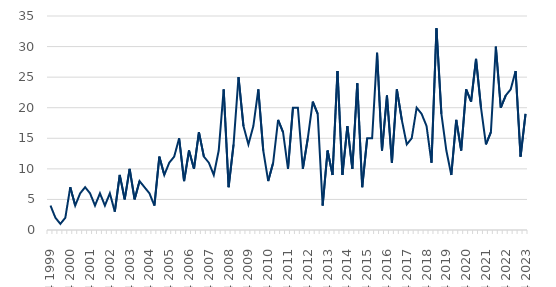
| Category | Series 0 |
|---|---|
| Q4 1999 | 4 |
| Q1 2000 | 2 |
| Q2 2000 | 1 |
| Q3 2000 | 2 |
| Q4 2000 | 7 |
| Q1 2001 | 4 |
| Q2 2001 | 6 |
| Q3 2001 | 7 |
| Q4 2001 | 6 |
| Q1 2002 | 4 |
| Q2 2002 | 6 |
| Q3 2002 | 4 |
| Q4 2002 | 6 |
| Q1 2003 | 3 |
| Q2 2003 | 9 |
| Q3 2003 | 5 |
| Q4 2003 | 10 |
| Q1 2004 | 5 |
| Q2 2004 | 8 |
| Q3 2004 | 7 |
| Q4 2004 | 6 |
| Q1 2005 | 4 |
| Q2 2005 | 12 |
| Q3 2005 | 9 |
| Q4 2005 | 11 |
| Q1 2006 | 12 |
| Q2 2006 | 15 |
| Q3 2006 | 8 |
| Q4 2006 | 13 |
| Q1 2007 | 10 |
| Q2 2007 | 16 |
| Q3 2007 | 12 |
| Q4 2007 | 11 |
| Q1 2008 | 9 |
| Q2 2008 | 13 |
| Q3 2008 | 23 |
| Q4 2008 | 7 |
| Q1 2009 | 14 |
| Q2 2009 | 25 |
| Q3 2009 | 17 |
| Q4 2009 | 14 |
| Q1 2010 | 17 |
| Q2 2010 | 23 |
| Q3 2010 | 13 |
| Q4 2010 | 8 |
| Q1 2011 | 11 |
| Q2 2011 | 18 |
| Q3 2011 | 16 |
| Q4 2011 | 10 |
| Q1 2012 | 20 |
| Q2 2012 | 20 |
| Q3 2012 | 10 |
| Q4 2012 | 15 |
| Q1 2013 | 21 |
| Q2 2013 | 19 |
| Q3 2013 | 4 |
| Q4 2013 | 13 |
| Q1 2014 | 9 |
| Q2 2014 | 26 |
| Q3 2014 | 9 |
| Q4 2014 | 17 |
| Q1 2015 | 10 |
| Q2 2015 | 24 |
| Q3 2015 | 7 |
| Q4 2015 | 15 |
| Q1 2016 | 15 |
| Q2 2016 | 29 |
| Q3 2016 | 13 |
| Q4 2016 | 22 |
| Q1 2017 | 11 |
| Q2 2017 | 23 |
| Q3 2017 | 18 |
| Q4 2017 | 14 |
| Q1 2018 | 15 |
| Q2 2018 | 20 |
| Q3 2018 | 19 |
| Q4 2018 | 17 |
| Q1 2019 | 11 |
| Q2 2019 | 33 |
| Q3 2019 | 19 |
| Q4 2019 | 13 |
| Q1 2020 | 9 |
| Q2 2020 | 18 |
| Q3 2020 | 13 |
| Q4 2020 | 23 |
| Q1 2021 | 21 |
| Q2 2021 | 28 |
| Q3 2021 | 20 |
| Q4 2021 | 14 |
| Q1 2022 | 16 |
| Q2 2022 | 30 |
| Q3 2022 | 20 |
| Q4 2022 | 22 |
| Q1 2023 | 23 |
| Q2 2023 | 26 |
| Q3 2023 | 12 |
| Q4 2023 | 19 |